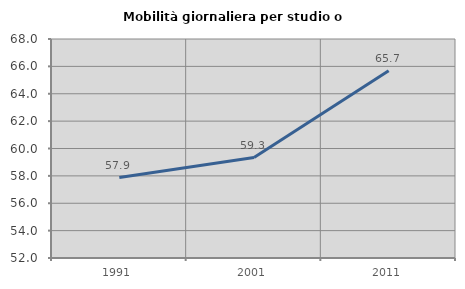
| Category | Mobilità giornaliera per studio o lavoro |
|---|---|
| 1991.0 | 57.875 |
| 2001.0 | 59.338 |
| 2011.0 | 65.684 |